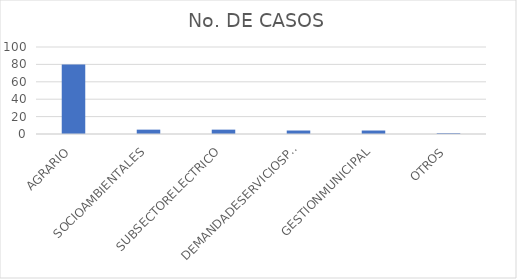
| Category | No. DE CASOS |
|---|---|
| AGRARIO | 80 |
| SOCIOAMBIENTALES | 5 |
| SUBSECTORELECTRICO | 5 |
| DEMANDADESERVICIOSPUBLICOS | 4 |
| GESTIONMUNICIPAL | 4 |
| OTROS | 1 |